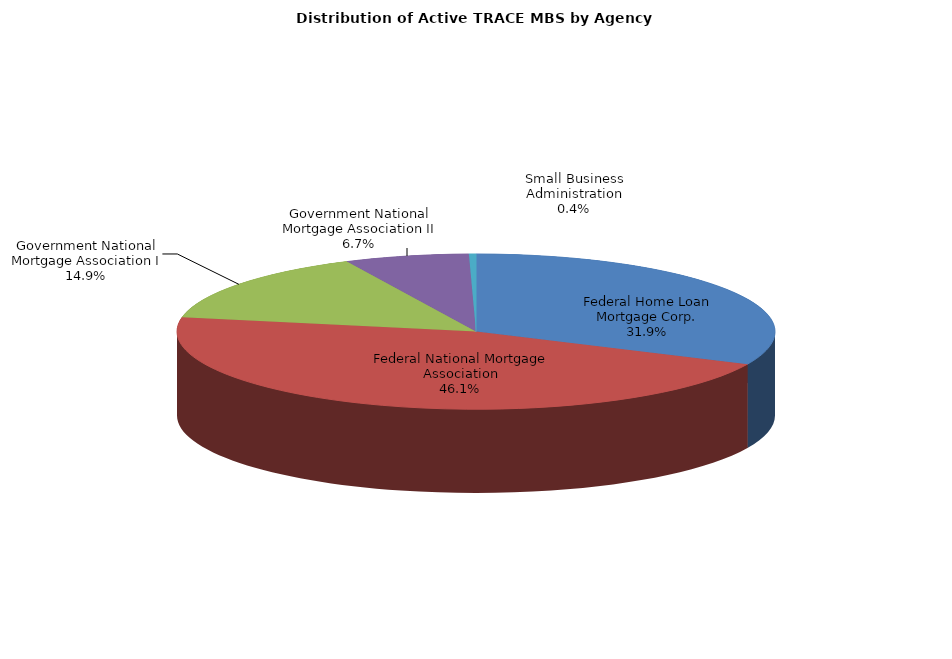
| Category | Series 0 |
|---|---|
| Federal Home Loan Mortgage Corp. | 359729 |
| Federal National Mortgage Association | 519693 |
| Government National Mortgage Association I | 168556 |
| Government National Mortgage Association II | 75860 |
| Small Business Administration | 4284 |